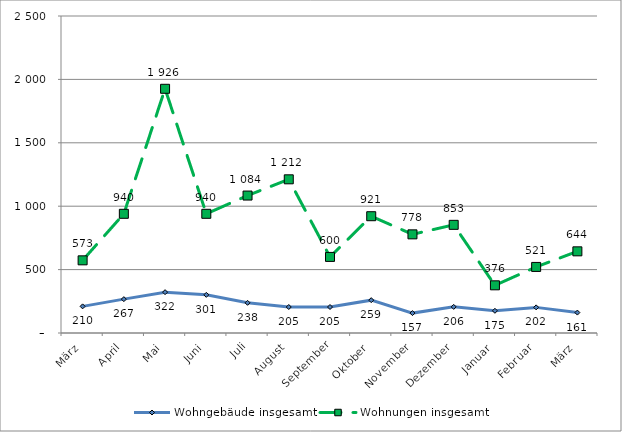
| Category | Wohngebäude insgesamt | Wohnungen insgesamt |
|---|---|---|
| März | 210 | 573 |
| April | 267 | 940 |
| Mai | 322 | 1926 |
| Juni | 301 | 940 |
| Juli | 238 | 1084 |
| August | 205 | 1212 |
| September | 205 | 600 |
| Oktober | 259 | 921 |
| November | 157 | 778 |
| Dezember | 206 | 853 |
| Januar | 175 | 376 |
| Februar | 202 | 521 |
| März | 161 | 644 |